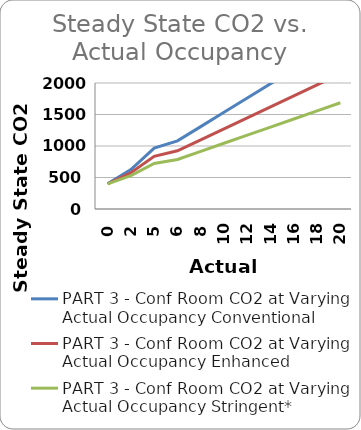
| Category | PART 3 - Conf Room CO2 at Varying Actual Occupancy |
|---|---|
| 0.0 | 400 |
| 2.0 | 528.623 |
| 5.0 | 721.557 |
| 6.0 | 785.868 |
| 8.0 | 914.491 |
| 10.0 | 1043.114 |
| 12.0 | 1171.737 |
| 14.0 | 1300.359 |
| 16.0 | 1428.982 |
| 18.0 | 1557.605 |
| 20.0 | 1686.228 |